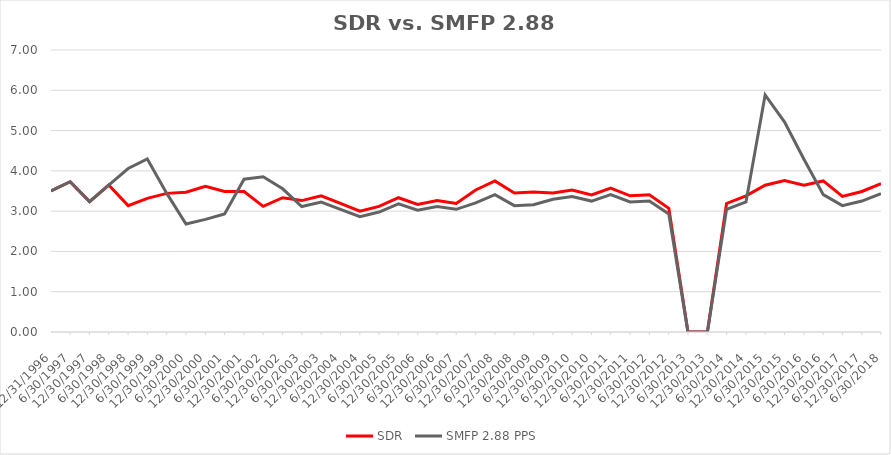
| Category | SDR | SMFP 2.88 PPS |
|---|---|---|
| 12/31/96 | 3.5 | 3.5 |
| 6/30/97 | 3.731 | 3.731 |
| 12/31/97 | 3.235 | 3.235 |
| 6/30/98 | 3.647 | 3.647 |
| 12/31/98 | 3.136 | 4.059 |
| 6/30/99 | 3.318 | 4.294 |
| 12/31/99 | 3.441 | 3.441 |
| 6/30/00 | 3.471 | 2.682 |
| 12/31/00 | 3.618 | 2.795 |
| 6/30/01 | 3.486 | 2.932 |
| 12/31/01 | 3.486 | 3.794 |
| 6/30/02 | 3.119 | 3.853 |
| 12/31/02 | 3.333 | 3.555 |
| 6/30/03 | 3.262 | 3.114 |
| 12/31/03 | 3.381 | 3.227 |
| 6/30/04 | 3.19 | 3.045 |
| 12/31/04 | 3 | 2.864 |
| 6/30/05 | 3.119 | 2.977 |
| 12/31/05 | 3.333 | 3.182 |
| 6/30/06 | 3.167 | 3.023 |
| 12/31/06 | 3.262 | 3.114 |
| 6/30/07 | 3.19 | 3.045 |
| 12/31/07 | 3.525 | 3.205 |
| 6/30/08 | 3.75 | 3.409 |
| 12/31/08 | 3.45 | 3.136 |
| 6/30/09 | 3.475 | 3.159 |
| 12/31/09 | 3.452 | 3.295 |
| 6/30/10 | 3.524 | 3.364 |
| 12/31/10 | 3.405 | 3.25 |
| 6/30/11 | 3.571 | 3.409 |
| 12/31/11 | 3.381 | 3.227 |
| 6/30/12 | 3.405 | 3.25 |
| 12/31/12 | 3.071 | 2.932 |
| 6/30/13 | 0 | 0 |
| 12/31/13 | 0 | 0 |
| 6/30/14 | 3.19 | 3.045 |
| 12/31/14 | 3.381 | 3.227 |
| 6/30/15 | 3.643 | 5.885 |
| 12/31/15 | 3.762 | 5.209 |
| 6/30/16 | 3.643 | 4.293 |
| 12/31/16 | 3.75 | 3.409 |
| 6/30/17 | 3.366 | 3.136 |
| 12/31/17 | 3.488 | 3.25 |
| 6/30/18 | 3.683 | 3.432 |